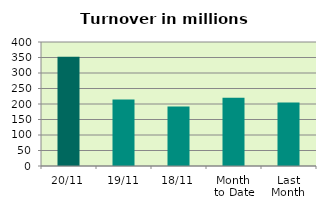
| Category | Series 0 |
|---|---|
| 20/11 | 352.18 |
| 19/11 | 214.338 |
| 18/11 | 192.2 |
| Month 
to Date | 220.107 |
| Last
Month | 204.729 |